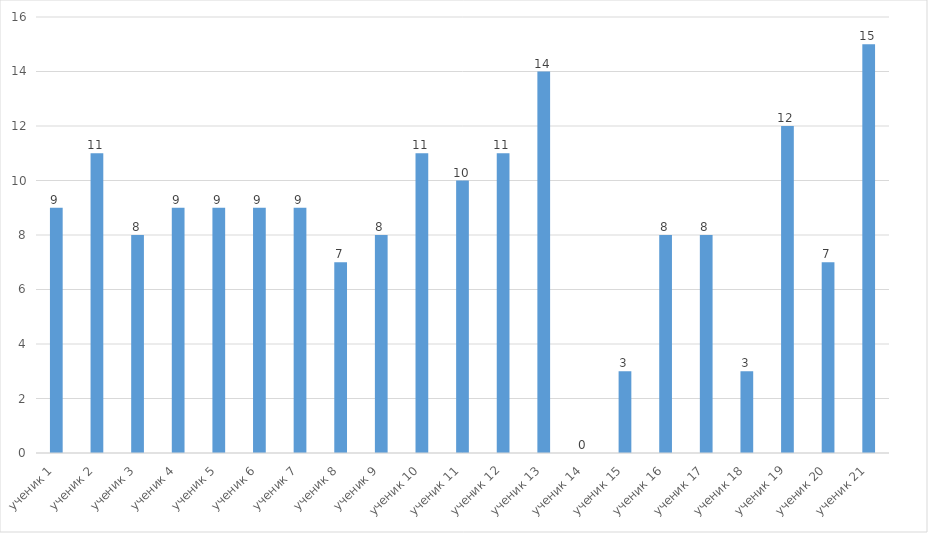
| Category | Series 0 |
|---|---|
| ученик 1 | 9 |
| ученик 2 | 11 |
| ученик 3 | 8 |
| ученик 4 | 9 |
| ученик 5 | 9 |
| ученик 6 | 9 |
| ученик 7 | 9 |
| ученик 8 | 7 |
| ученик 9 | 8 |
| ученик 10 | 11 |
| ученик 11 | 10 |
|  ученик 12 | 11 |
| ученик 13 | 14 |
| ученик 14 | 0 |
| ученик 15 | 3 |
| ученик 16 | 8 |
| ученик 17 | 8 |
| ученик 18 | 3 |
|  ученик 19 | 12 |
| ученик 20 | 7 |
| ученик 21 | 15 |